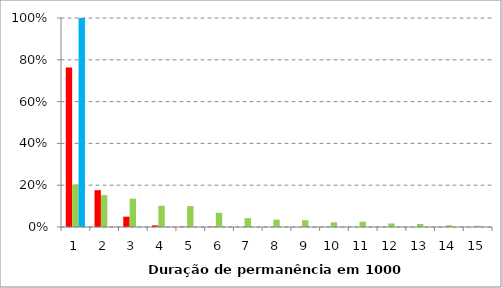
| Category | Series 0 | Series 1 | Series 2 |
|---|---|---|---|
| 0 | 0.764 | 0.203 | 1 |
| 1 | 0.176 | 0.153 | 0 |
| 2 | 0.049 | 0.136 | 0 |
| 3 | 0.008 | 0.102 | 0 |
| 4 | 0.002 | 0.1 | 0 |
| 5 | 0.002 | 0.068 | 0 |
| 6 | 0 | 0.042 | 0 |
| 7 | 0 | 0.035 | 0 |
| 8 | 0 | 0.032 | 0 |
| 9 | 0 | 0.023 | 0 |
| 10 | 0 | 0.025 | 0 |
| 11 | 0 | 0.017 | 0 |
| 12 | 0 | 0.014 | 0 |
| 13 | 0 | 0.008 | 0 |
| 14 | 0 | 0.006 | 0 |